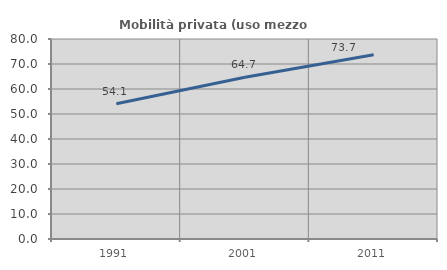
| Category | Mobilità privata (uso mezzo privato) |
|---|---|
| 1991.0 | 54.062 |
| 2001.0 | 64.706 |
| 2011.0 | 73.731 |